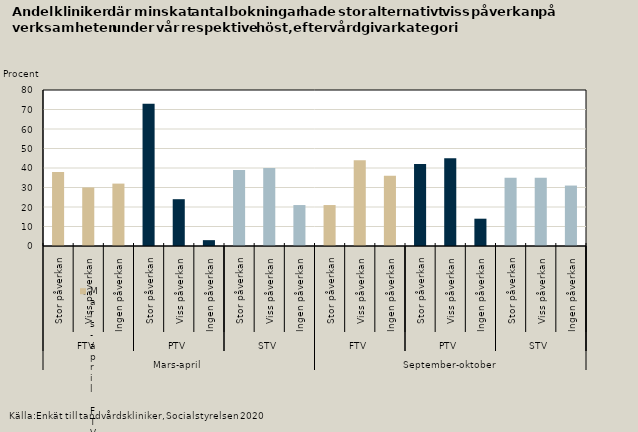
| Category | Minskat antal bokningar |
|---|---|
| 0 | 38 |
| 1 | 30 |
| 2 | 32 |
| 3 | 73 |
| 4 | 24 |
| 5 | 3 |
| 6 | 39 |
| 7 | 40 |
| 8 | 21 |
| 9 | 21 |
| 10 | 44 |
| 11 | 36 |
| 12 | 42 |
| 13 | 45 |
| 14 | 14 |
| 15 | 35 |
| 16 | 35 |
| 17 | 31 |